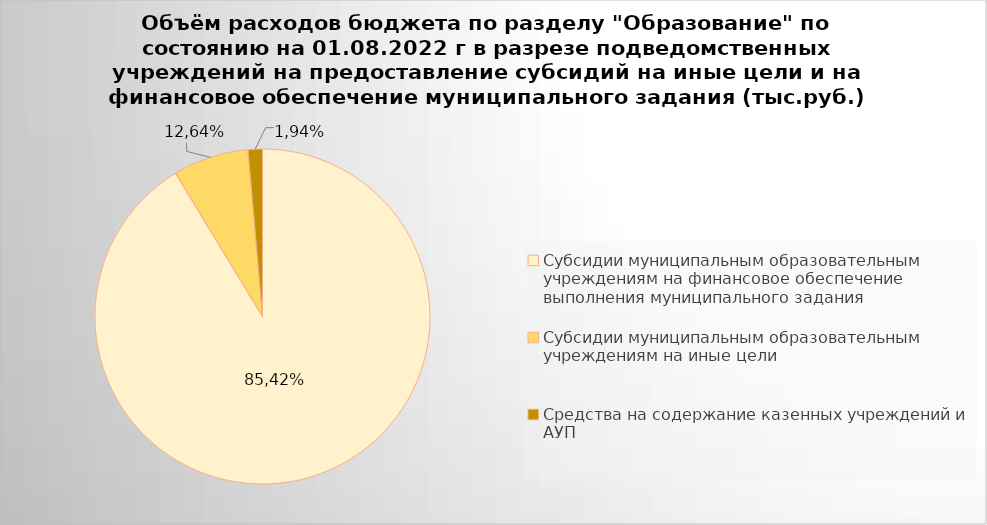
| Category | Series 0 |
|---|---|
| Субсидии муниципальным образовательным учреждениям на финансовое обеспечение выполнения муниципального задания | 7034234.63 |
| Субсидии муниципальным образовательным учреждениям на иные цели | 562532.72 |
| Средства на содержание казенных учреждений и АУП | 107154.09 |